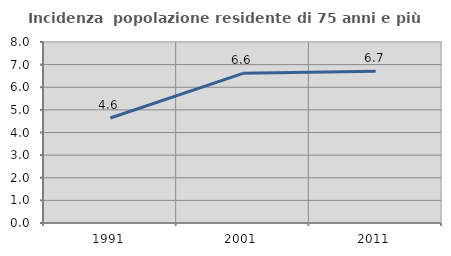
| Category | Incidenza  popolazione residente di 75 anni e più |
|---|---|
| 1991.0 | 4.641 |
| 2001.0 | 6.615 |
| 2011.0 | 6.707 |